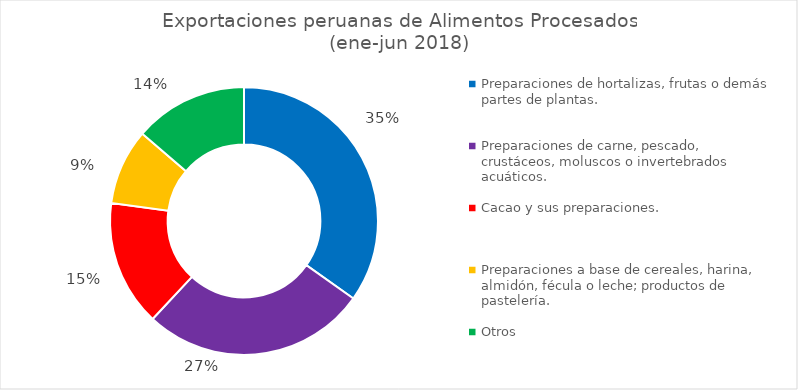
| Category | Series 0 |
|---|---|
| Preparaciones de hortalizas, frutas o demás partes de plantas. | 0.348 |
| Preparaciones de carne, pescado, crustáceos, moluscos o invertebrados acuáticos. | 0.271 |
| Cacao y sus preparaciones. | 0.152 |
| Preparaciones a base de cereales, harina, almidón, fécula o leche; productos de pastelería. | 0.091 |
| Otros | 0.137 |